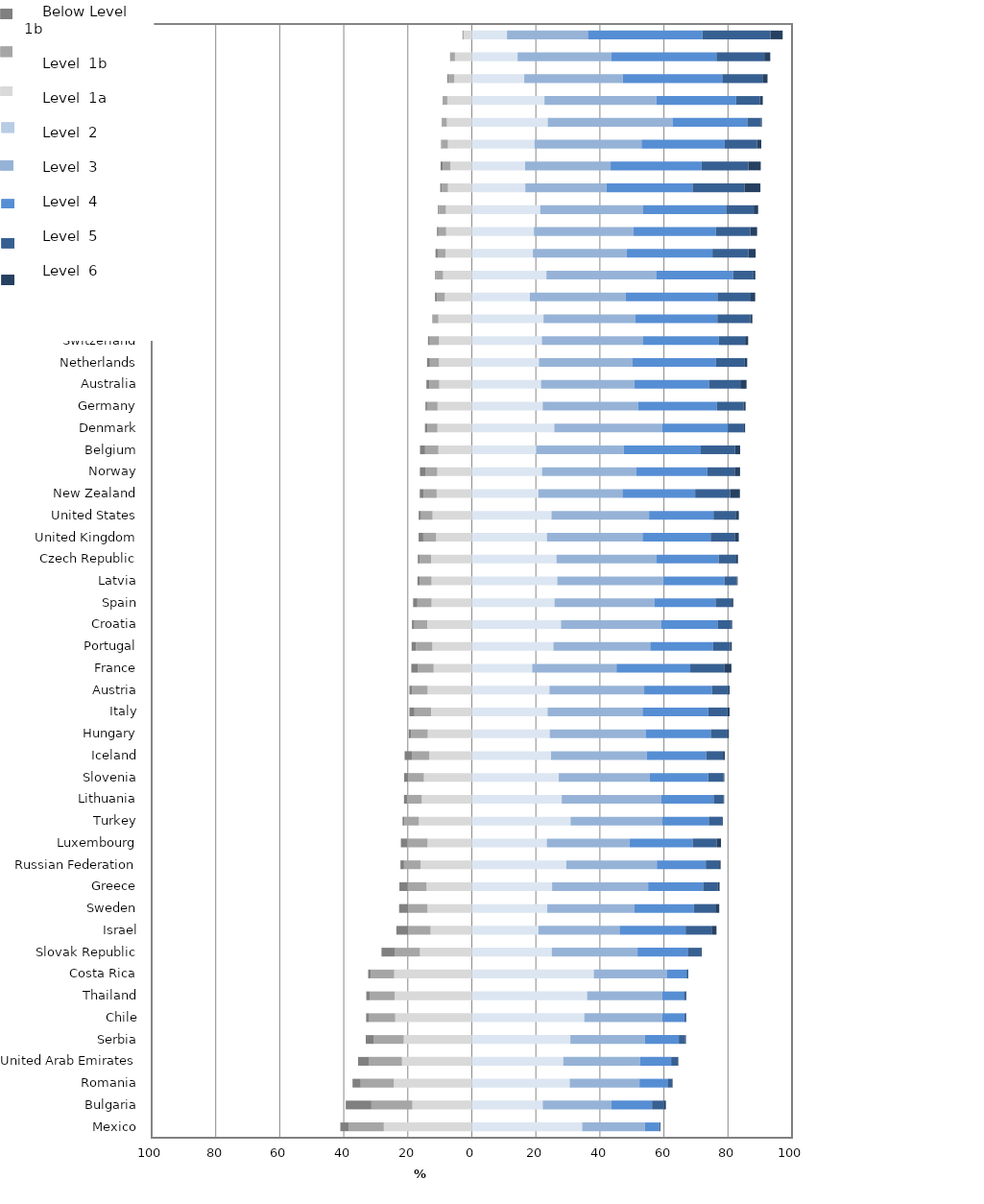
| Category | Level 1a | Level 1b | Below Level 1b | Level 2 | Level 3 | Level 4 | Level 5 | Level 6 |
|---|---|---|---|---|---|---|---|---|
| Shanghai-China | -2.515 | -0.299 | -0.095 | 10.986 | 25.262 | 35.747 | 21.303 | 3.792 |
| Hong Kong-China | -5.28 | -1.29 | -0.22 | 14.29 | 29.197 | 32.912 | 14.947 | 1.864 |
| Korea | -5.495 | -1.713 | -0.439 | 16.366 | 30.817 | 31.022 | 12.573 | 1.574 |
| Estonia | -7.665 | -1.3 | -0.159 | 22.686 | 35.008 | 24.864 | 7.466 | 0.851 |
| Vietnam | -7.814 | -1.469 | -0.133 | 23.721 | 38.951 | 23.366 | 4.175 | 0.372 |
| Ireland | -7.473 | -1.855 | -0.263 | 19.565 | 33.446 | 25.975 | 10.08 | 1.344 |
| Japan | -6.7 | -2.411 | -0.65 | 16.641 | 26.704 | 28.417 | 14.612 | 3.865 |
| Singapore | -7.458 | -1.945 | -0.464 | 16.692 | 25.393 | 26.85 | 16.201 | 4.998 |
| Poland | -8.105 | -2.145 | -0.327 | 21.373 | 31.995 | 26.044 | 8.634 | 1.378 |
| Canada | -8.03 | -2.381 | -0.483 | 19.381 | 31.034 | 25.838 | 10.755 | 2.097 |
| Finland | -8.233 | -2.435 | -0.681 | 19.065 | 29.291 | 26.795 | 11.272 | 2.228 |
| Macao-China | -8.992 | -2.119 | -0.345 | 23.294 | 34.269 | 23.998 | 6.421 | 0.562 |
| Chinese Taipei | -8.442 | -2.466 | -0.589 | 18.127 | 29.883 | 28.703 | 10.393 | 1.397 |
| Liechtenstein | -10.461 | -1.915 | 0 | 22.379 | 28.631 | 25.674 | 10.353 | 0.588 |
| Switzerland | -10.264 | -2.895 | -0.534 | 21.885 | 31.486 | 23.813 | 8.171 | 0.951 |
| Netherlands | -10.267 | -2.842 | -0.881 | 20.968 | 29.236 | 26.057 | 9 | 0.751 |
| Australia | -10.186 | -3.106 | -0.9 | 21.622 | 29.102 | 23.337 | 9.798 | 1.949 |
| Germany | -10.703 | -3.267 | -0.522 | 22.131 | 29.866 | 24.577 | 8.261 | 0.674 |
| Denmark | -10.743 | -3.112 | -0.789 | 25.763 | 33.638 | 20.536 | 5.057 | 0.361 |
| Belgium | -10.451 | -4.139 | -1.6 | 20.15 | 27.327 | 24.039 | 10.713 | 1.581 |
| Norway | -10.811 | -3.717 | -1.693 | 21.941 | 29.362 | 22.262 | 8.532 | 1.682 |
| New Zealand | -10.982 | -4.023 | -1.265 | 20.789 | 26.258 | 22.706 | 10.932 | 3.045 |
| United States | -12.283 | -3.56 | -0.761 | 24.871 | 30.486 | 20.118 | 6.915 | 1.006 |
| United Kingdom | -11.18 | -3.987 | -1.458 | 23.456 | 29.865 | 21.273 | 7.514 | 1.267 |
| Czech Republic | -12.745 | -3.506 | -0.615 | 26.435 | 31.292 | 19.354 | 5.277 | 0.776 |
| Latvia | -12.596 | -3.732 | -0.651 | 26.685 | 33.088 | 19.091 | 3.877 | 0.28 |
| Spain | -12.591 | -4.414 | -1.339 | 25.822 | 31.155 | 19.16 | 5.012 | 0.508 |
| Croatia | -13.948 | -4.002 | -0.748 | 27.847 | 31.226 | 17.828 | 4.169 | 0.232 |
| Portugal | -12.344 | -5.14 | -1.329 | 25.479 | 30.245 | 19.669 | 5.324 | 0.469 |
| France | -11.93 | -4.862 | -2.125 | 18.858 | 26.333 | 23.03 | 10.594 | 2.268 |
| Austria | -13.83 | -4.823 | -0.838 | 24.238 | 29.6 | 21.154 | 5.195 | 0.323 |
| Italy | -12.734 | -5.183 | -1.584 | 23.661 | 29.666 | 20.478 | 6.059 | 0.635 |
| Hungary | -13.77 | -5.201 | -0.75 | 24.325 | 29.947 | 20.357 | 5.259 | 0.391 |
| Iceland | -13.332 | -5.394 | -2.27 | 24.745 | 29.855 | 18.599 | 5.247 | 0.558 |
| Slovenia | -14.976 | -4.942 | -1.226 | 27.151 | 28.435 | 18.238 | 4.705 | 0.328 |
| Lithuania | -15.648 | -4.595 | -0.956 | 28.074 | 31.114 | 16.319 | 3.136 | 0.158 |
| Turkey | -16.576 | -4.496 | -0.563 | 30.831 | 28.69 | 14.497 | 4.08 | 0.268 |
| Luxembourg | -13.843 | -6.318 | -2.009 | 23.427 | 25.839 | 19.686 | 7.487 | 1.392 |
| Russian Federation | -16.013 | -5.166 | -1.12 | 29.499 | 28.29 | 15.282 | 4.171 | 0.458 |
| Greece | -14.161 | -5.875 | -2.591 | 25.068 | 30.001 | 17.17 | 4.629 | 0.504 |
| Sweden | -13.874 | -5.989 | -2.856 | 23.55 | 27.252 | 18.559 | 6.7 | 1.22 |
| Israel | -12.896 | -6.934 | -3.754 | 20.809 | 25.341 | 20.624 | 8.116 | 1.526 |
| Slovak Republic | -16.215 | -7.924 | -4.078 | 24.978 | 26.786 | 15.658 | 4.073 | 0.287 |
| Costa Rica | -24.259 | -7.321 | -0.803 | 38.107 | 22.912 | 6.039 | 0.55 | 0.01 |
| Thailand | -24.098 | -7.706 | -1.166 | 36.004 | 23.49 | 6.717 | 0.768 | 0.052 |
| Chile | -23.935 | -8.122 | -0.959 | 35.131 | 24.349 | 6.904 | 0.586 | 0.015 |
| Serbia | -21.263 | -9.299 | -2.566 | 30.763 | 23.337 | 10.548 | 2.016 | 0.208 |
| United Arab Emirates | -21.816 | -10.426 | -3.286 | 28.564 | 23.96 | 9.728 | 2.059 | 0.16 |
| Romania | -24.379 | -10.34 | -2.544 | 30.575 | 21.79 | 8.75 | 1.52 | 0.101 |
| Bulgaria | -18.59 | -12.783 | -8.017 | 22.152 | 21.446 | 12.682 | 3.779 | 0.549 |
| Mexico | -27.497 | -10.978 | -2.602 | 34.462 | 19.584 | 4.46 | 0.399 | 0.018 |